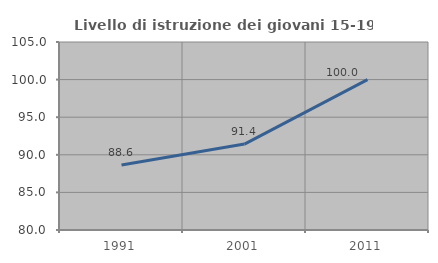
| Category | Livello di istruzione dei giovani 15-19 anni |
|---|---|
| 1991.0 | 88.636 |
| 2001.0 | 91.429 |
| 2011.0 | 100 |